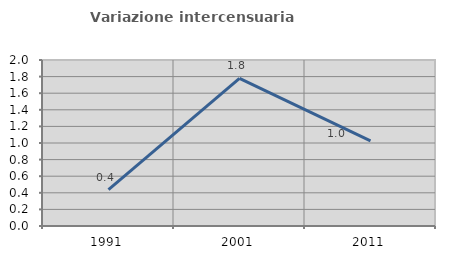
| Category | Variazione intercensuaria annua |
|---|---|
| 1991.0 | 0.438 |
| 2001.0 | 1.778 |
| 2011.0 | 1.026 |